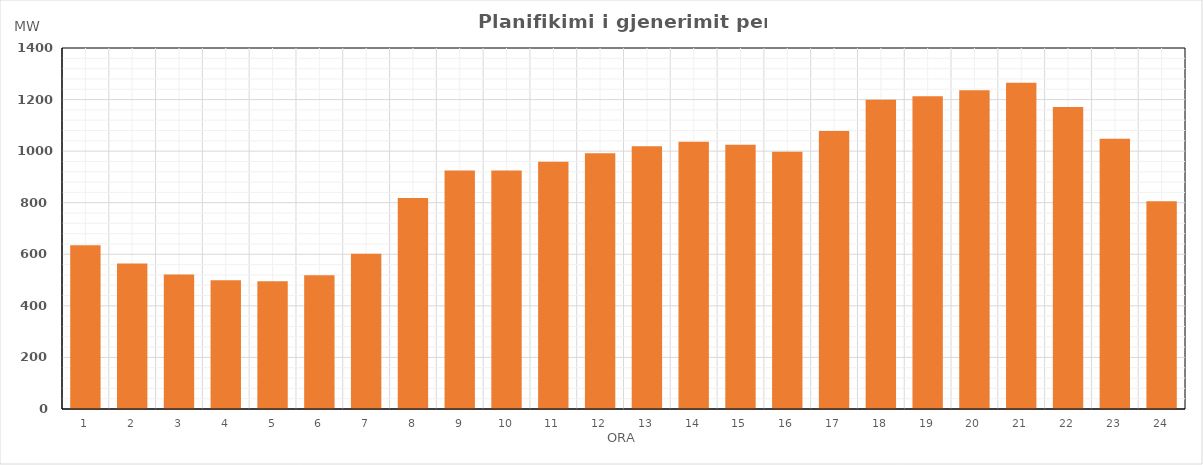
| Category | Max (MW) |
|---|---|
| 0 | 635.14 |
| 1 | 564.02 |
| 2 | 521.6 |
| 3 | 499.63 |
| 4 | 495.02 |
| 5 | 518.92 |
| 6 | 602.47 |
| 7 | 817.97 |
| 8 | 925.1 |
| 9 | 925.2 |
| 10 | 959.23 |
| 11 | 992.31 |
| 12 | 1019 |
| 13 | 1036.62 |
| 14 | 1024.91 |
| 15 | 997.73 |
| 16 | 1078.44 |
| 17 | 1199.53 |
| 18 | 1213.12 |
| 19 | 1236.63 |
| 20 | 1265.39 |
| 21 | 1170.98 |
| 22 | 1047.59 |
| 23 | 805.68 |